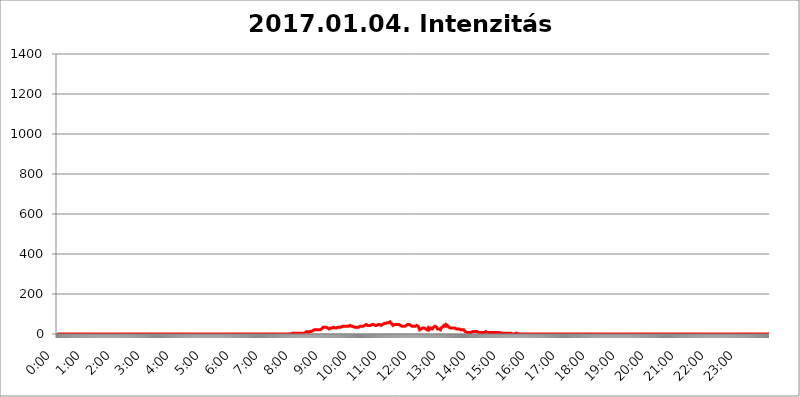
| Category | 2017.01.04. Intenzitás [W/m^2] |
|---|---|
| 0.0 | 0 |
| 0.0006944444444444445 | 0 |
| 0.001388888888888889 | 0 |
| 0.0020833333333333333 | 0 |
| 0.002777777777777778 | 0 |
| 0.003472222222222222 | 0 |
| 0.004166666666666667 | 0 |
| 0.004861111111111111 | 0 |
| 0.005555555555555556 | 0 |
| 0.0062499999999999995 | 0 |
| 0.006944444444444444 | 0 |
| 0.007638888888888889 | 0 |
| 0.008333333333333333 | 0 |
| 0.009027777777777779 | 0 |
| 0.009722222222222222 | 0 |
| 0.010416666666666666 | 0 |
| 0.011111111111111112 | 0 |
| 0.011805555555555555 | 0 |
| 0.012499999999999999 | 0 |
| 0.013194444444444444 | 0 |
| 0.013888888888888888 | 0 |
| 0.014583333333333332 | 0 |
| 0.015277777777777777 | 0 |
| 0.015972222222222224 | 0 |
| 0.016666666666666666 | 0 |
| 0.017361111111111112 | 0 |
| 0.018055555555555557 | 0 |
| 0.01875 | 0 |
| 0.019444444444444445 | 0 |
| 0.02013888888888889 | 0 |
| 0.020833333333333332 | 0 |
| 0.02152777777777778 | 0 |
| 0.022222222222222223 | 0 |
| 0.02291666666666667 | 0 |
| 0.02361111111111111 | 0 |
| 0.024305555555555556 | 0 |
| 0.024999999999999998 | 0 |
| 0.025694444444444447 | 0 |
| 0.02638888888888889 | 0 |
| 0.027083333333333334 | 0 |
| 0.027777777777777776 | 0 |
| 0.02847222222222222 | 0 |
| 0.029166666666666664 | 0 |
| 0.029861111111111113 | 0 |
| 0.030555555555555555 | 0 |
| 0.03125 | 0 |
| 0.03194444444444445 | 0 |
| 0.03263888888888889 | 0 |
| 0.03333333333333333 | 0 |
| 0.034027777777777775 | 0 |
| 0.034722222222222224 | 0 |
| 0.035416666666666666 | 0 |
| 0.036111111111111115 | 0 |
| 0.03680555555555556 | 0 |
| 0.0375 | 0 |
| 0.03819444444444444 | 0 |
| 0.03888888888888889 | 0 |
| 0.03958333333333333 | 0 |
| 0.04027777777777778 | 0 |
| 0.04097222222222222 | 0 |
| 0.041666666666666664 | 0 |
| 0.042361111111111106 | 0 |
| 0.04305555555555556 | 0 |
| 0.043750000000000004 | 0 |
| 0.044444444444444446 | 0 |
| 0.04513888888888889 | 0 |
| 0.04583333333333334 | 0 |
| 0.04652777777777778 | 0 |
| 0.04722222222222222 | 0 |
| 0.04791666666666666 | 0 |
| 0.04861111111111111 | 0 |
| 0.049305555555555554 | 0 |
| 0.049999999999999996 | 0 |
| 0.05069444444444445 | 0 |
| 0.051388888888888894 | 0 |
| 0.052083333333333336 | 0 |
| 0.05277777777777778 | 0 |
| 0.05347222222222222 | 0 |
| 0.05416666666666667 | 0 |
| 0.05486111111111111 | 0 |
| 0.05555555555555555 | 0 |
| 0.05625 | 0 |
| 0.05694444444444444 | 0 |
| 0.057638888888888885 | 0 |
| 0.05833333333333333 | 0 |
| 0.05902777777777778 | 0 |
| 0.059722222222222225 | 0 |
| 0.06041666666666667 | 0 |
| 0.061111111111111116 | 0 |
| 0.06180555555555556 | 0 |
| 0.0625 | 0 |
| 0.06319444444444444 | 0 |
| 0.06388888888888888 | 0 |
| 0.06458333333333334 | 0 |
| 0.06527777777777778 | 0 |
| 0.06597222222222222 | 0 |
| 0.06666666666666667 | 0 |
| 0.06736111111111111 | 0 |
| 0.06805555555555555 | 0 |
| 0.06874999999999999 | 0 |
| 0.06944444444444443 | 0 |
| 0.07013888888888889 | 0 |
| 0.07083333333333333 | 0 |
| 0.07152777777777779 | 0 |
| 0.07222222222222223 | 0 |
| 0.07291666666666667 | 0 |
| 0.07361111111111111 | 0 |
| 0.07430555555555556 | 0 |
| 0.075 | 0 |
| 0.07569444444444444 | 0 |
| 0.0763888888888889 | 0 |
| 0.07708333333333334 | 0 |
| 0.07777777777777778 | 0 |
| 0.07847222222222222 | 0 |
| 0.07916666666666666 | 0 |
| 0.0798611111111111 | 0 |
| 0.08055555555555556 | 0 |
| 0.08125 | 0 |
| 0.08194444444444444 | 0 |
| 0.08263888888888889 | 0 |
| 0.08333333333333333 | 0 |
| 0.08402777777777777 | 0 |
| 0.08472222222222221 | 0 |
| 0.08541666666666665 | 0 |
| 0.08611111111111112 | 0 |
| 0.08680555555555557 | 0 |
| 0.08750000000000001 | 0 |
| 0.08819444444444445 | 0 |
| 0.08888888888888889 | 0 |
| 0.08958333333333333 | 0 |
| 0.09027777777777778 | 0 |
| 0.09097222222222222 | 0 |
| 0.09166666666666667 | 0 |
| 0.09236111111111112 | 0 |
| 0.09305555555555556 | 0 |
| 0.09375 | 0 |
| 0.09444444444444444 | 0 |
| 0.09513888888888888 | 0 |
| 0.09583333333333333 | 0 |
| 0.09652777777777777 | 0 |
| 0.09722222222222222 | 0 |
| 0.09791666666666667 | 0 |
| 0.09861111111111111 | 0 |
| 0.09930555555555555 | 0 |
| 0.09999999999999999 | 0 |
| 0.10069444444444443 | 0 |
| 0.1013888888888889 | 0 |
| 0.10208333333333335 | 0 |
| 0.10277777777777779 | 0 |
| 0.10347222222222223 | 0 |
| 0.10416666666666667 | 0 |
| 0.10486111111111111 | 0 |
| 0.10555555555555556 | 0 |
| 0.10625 | 0 |
| 0.10694444444444444 | 0 |
| 0.1076388888888889 | 0 |
| 0.10833333333333334 | 0 |
| 0.10902777777777778 | 0 |
| 0.10972222222222222 | 0 |
| 0.1111111111111111 | 0 |
| 0.11180555555555556 | 0 |
| 0.11180555555555556 | 0 |
| 0.1125 | 0 |
| 0.11319444444444444 | 0 |
| 0.11388888888888889 | 0 |
| 0.11458333333333333 | 0 |
| 0.11527777777777777 | 0 |
| 0.11597222222222221 | 0 |
| 0.11666666666666665 | 0 |
| 0.1173611111111111 | 0 |
| 0.11805555555555557 | 0 |
| 0.11944444444444445 | 0 |
| 0.12013888888888889 | 0 |
| 0.12083333333333333 | 0 |
| 0.12152777777777778 | 0 |
| 0.12222222222222223 | 0 |
| 0.12291666666666667 | 0 |
| 0.12291666666666667 | 0 |
| 0.12361111111111112 | 0 |
| 0.12430555555555556 | 0 |
| 0.125 | 0 |
| 0.12569444444444444 | 0 |
| 0.12638888888888888 | 0 |
| 0.12708333333333333 | 0 |
| 0.16875 | 0 |
| 0.12847222222222224 | 0 |
| 0.12916666666666668 | 0 |
| 0.12986111111111112 | 0 |
| 0.13055555555555556 | 0 |
| 0.13125 | 0 |
| 0.13194444444444445 | 0 |
| 0.1326388888888889 | 0 |
| 0.13333333333333333 | 0 |
| 0.13402777777777777 | 0 |
| 0.13402777777777777 | 0 |
| 0.13472222222222222 | 0 |
| 0.13541666666666666 | 0 |
| 0.1361111111111111 | 0 |
| 0.13749999999999998 | 0 |
| 0.13819444444444443 | 0 |
| 0.1388888888888889 | 0 |
| 0.13958333333333334 | 0 |
| 0.14027777777777778 | 0 |
| 0.14097222222222222 | 0 |
| 0.14166666666666666 | 0 |
| 0.1423611111111111 | 0 |
| 0.14305555555555557 | 0 |
| 0.14375000000000002 | 0 |
| 0.14444444444444446 | 0 |
| 0.1451388888888889 | 0 |
| 0.1451388888888889 | 0 |
| 0.14652777777777778 | 0 |
| 0.14722222222222223 | 0 |
| 0.14791666666666667 | 0 |
| 0.1486111111111111 | 0 |
| 0.14930555555555555 | 0 |
| 0.15 | 0 |
| 0.15069444444444444 | 0 |
| 0.15138888888888888 | 0 |
| 0.15208333333333332 | 0 |
| 0.15277777777777776 | 0 |
| 0.15347222222222223 | 0 |
| 0.15416666666666667 | 0 |
| 0.15486111111111112 | 0 |
| 0.15555555555555556 | 0 |
| 0.15625 | 0 |
| 0.15694444444444444 | 0 |
| 0.15763888888888888 | 0 |
| 0.15833333333333333 | 0 |
| 0.15902777777777777 | 0 |
| 0.15972222222222224 | 0 |
| 0.16041666666666668 | 0 |
| 0.16111111111111112 | 0 |
| 0.16180555555555556 | 0 |
| 0.1625 | 0 |
| 0.16319444444444445 | 0 |
| 0.1638888888888889 | 0 |
| 0.16458333333333333 | 0 |
| 0.16527777777777777 | 0 |
| 0.16597222222222222 | 0 |
| 0.16666666666666666 | 0 |
| 0.1673611111111111 | 0 |
| 0.16805555555555554 | 0 |
| 0.16874999999999998 | 0 |
| 0.16944444444444443 | 0 |
| 0.17013888888888887 | 0 |
| 0.1708333333333333 | 0 |
| 0.17152777777777775 | 0 |
| 0.17222222222222225 | 0 |
| 0.1729166666666667 | 0 |
| 0.17361111111111113 | 0 |
| 0.17430555555555557 | 0 |
| 0.17500000000000002 | 0 |
| 0.17569444444444446 | 0 |
| 0.1763888888888889 | 0 |
| 0.17708333333333334 | 0 |
| 0.17777777777777778 | 0 |
| 0.17847222222222223 | 0 |
| 0.17916666666666667 | 0 |
| 0.1798611111111111 | 0 |
| 0.18055555555555555 | 0 |
| 0.18125 | 0 |
| 0.18194444444444444 | 0 |
| 0.1826388888888889 | 0 |
| 0.18333333333333335 | 0 |
| 0.1840277777777778 | 0 |
| 0.18472222222222223 | 0 |
| 0.18541666666666667 | 0 |
| 0.18611111111111112 | 0 |
| 0.18680555555555556 | 0 |
| 0.1875 | 0 |
| 0.18819444444444444 | 0 |
| 0.18888888888888888 | 0 |
| 0.18958333333333333 | 0 |
| 0.19027777777777777 | 0 |
| 0.1909722222222222 | 0 |
| 0.19166666666666665 | 0 |
| 0.19236111111111112 | 0 |
| 0.19305555555555554 | 0 |
| 0.19375 | 0 |
| 0.19444444444444445 | 0 |
| 0.1951388888888889 | 0 |
| 0.19583333333333333 | 0 |
| 0.19652777777777777 | 0 |
| 0.19722222222222222 | 0 |
| 0.19791666666666666 | 0 |
| 0.1986111111111111 | 0 |
| 0.19930555555555554 | 0 |
| 0.19999999999999998 | 0 |
| 0.20069444444444443 | 0 |
| 0.20138888888888887 | 0 |
| 0.2020833333333333 | 0 |
| 0.2027777777777778 | 0 |
| 0.2034722222222222 | 0 |
| 0.2041666666666667 | 0 |
| 0.20486111111111113 | 0 |
| 0.20555555555555557 | 0 |
| 0.20625000000000002 | 0 |
| 0.20694444444444446 | 0 |
| 0.2076388888888889 | 0 |
| 0.20833333333333334 | 0 |
| 0.20902777777777778 | 0 |
| 0.20972222222222223 | 0 |
| 0.21041666666666667 | 0 |
| 0.2111111111111111 | 0 |
| 0.21180555555555555 | 0 |
| 0.2125 | 0 |
| 0.21319444444444444 | 0 |
| 0.2138888888888889 | 0 |
| 0.21458333333333335 | 0 |
| 0.2152777777777778 | 0 |
| 0.21597222222222223 | 0 |
| 0.21666666666666667 | 0 |
| 0.21736111111111112 | 0 |
| 0.21805555555555556 | 0 |
| 0.21875 | 0 |
| 0.21944444444444444 | 0 |
| 0.22013888888888888 | 0 |
| 0.22083333333333333 | 0 |
| 0.22152777777777777 | 0 |
| 0.2222222222222222 | 0 |
| 0.22291666666666665 | 0 |
| 0.2236111111111111 | 0 |
| 0.22430555555555556 | 0 |
| 0.225 | 0 |
| 0.22569444444444445 | 0 |
| 0.2263888888888889 | 0 |
| 0.22708333333333333 | 0 |
| 0.22777777777777777 | 0 |
| 0.22847222222222222 | 0 |
| 0.22916666666666666 | 0 |
| 0.2298611111111111 | 0 |
| 0.23055555555555554 | 0 |
| 0.23124999999999998 | 0 |
| 0.23194444444444443 | 0 |
| 0.23263888888888887 | 0 |
| 0.2333333333333333 | 0 |
| 0.2340277777777778 | 0 |
| 0.2347222222222222 | 0 |
| 0.2354166666666667 | 0 |
| 0.23611111111111113 | 0 |
| 0.23680555555555557 | 0 |
| 0.23750000000000002 | 0 |
| 0.23819444444444446 | 0 |
| 0.2388888888888889 | 0 |
| 0.23958333333333334 | 0 |
| 0.24027777777777778 | 0 |
| 0.24097222222222223 | 0 |
| 0.24166666666666667 | 0 |
| 0.2423611111111111 | 0 |
| 0.24305555555555555 | 0 |
| 0.24375 | 0 |
| 0.24444444444444446 | 0 |
| 0.24513888888888888 | 0 |
| 0.24583333333333335 | 0 |
| 0.2465277777777778 | 0 |
| 0.24722222222222223 | 0 |
| 0.24791666666666667 | 0 |
| 0.24861111111111112 | 0 |
| 0.24930555555555556 | 0 |
| 0.25 | 0 |
| 0.25069444444444444 | 0 |
| 0.2513888888888889 | 0 |
| 0.2520833333333333 | 0 |
| 0.25277777777777777 | 0 |
| 0.2534722222222222 | 0 |
| 0.25416666666666665 | 0 |
| 0.2548611111111111 | 0 |
| 0.2555555555555556 | 0 |
| 0.25625000000000003 | 0 |
| 0.2569444444444445 | 0 |
| 0.2576388888888889 | 0 |
| 0.25833333333333336 | 0 |
| 0.2590277777777778 | 0 |
| 0.25972222222222224 | 0 |
| 0.2604166666666667 | 0 |
| 0.2611111111111111 | 0 |
| 0.26180555555555557 | 0 |
| 0.2625 | 0 |
| 0.26319444444444445 | 0 |
| 0.2638888888888889 | 0 |
| 0.26458333333333334 | 0 |
| 0.2652777777777778 | 0 |
| 0.2659722222222222 | 0 |
| 0.26666666666666666 | 0 |
| 0.2673611111111111 | 0 |
| 0.26805555555555555 | 0 |
| 0.26875 | 0 |
| 0.26944444444444443 | 0 |
| 0.2701388888888889 | 0 |
| 0.2708333333333333 | 0 |
| 0.27152777777777776 | 0 |
| 0.2722222222222222 | 0 |
| 0.27291666666666664 | 0 |
| 0.2736111111111111 | 0 |
| 0.2743055555555555 | 0 |
| 0.27499999999999997 | 0 |
| 0.27569444444444446 | 0 |
| 0.27638888888888885 | 0 |
| 0.27708333333333335 | 0 |
| 0.2777777777777778 | 0 |
| 0.27847222222222223 | 0 |
| 0.2791666666666667 | 0 |
| 0.2798611111111111 | 0 |
| 0.28055555555555556 | 0 |
| 0.28125 | 0 |
| 0.28194444444444444 | 0 |
| 0.2826388888888889 | 0 |
| 0.2833333333333333 | 0 |
| 0.28402777777777777 | 0 |
| 0.2847222222222222 | 0 |
| 0.28541666666666665 | 0 |
| 0.28611111111111115 | 0 |
| 0.28680555555555554 | 0 |
| 0.28750000000000003 | 0 |
| 0.2881944444444445 | 0 |
| 0.2888888888888889 | 0 |
| 0.28958333333333336 | 0 |
| 0.2902777777777778 | 0 |
| 0.29097222222222224 | 0 |
| 0.2916666666666667 | 0 |
| 0.2923611111111111 | 0 |
| 0.29305555555555557 | 0 |
| 0.29375 | 0 |
| 0.29444444444444445 | 0 |
| 0.2951388888888889 | 0 |
| 0.29583333333333334 | 0 |
| 0.2965277777777778 | 0 |
| 0.2972222222222222 | 0 |
| 0.29791666666666666 | 0 |
| 0.2986111111111111 | 0 |
| 0.29930555555555555 | 0 |
| 0.3 | 0 |
| 0.30069444444444443 | 0 |
| 0.3013888888888889 | 0 |
| 0.3020833333333333 | 0 |
| 0.30277777777777776 | 0 |
| 0.3034722222222222 | 0 |
| 0.30416666666666664 | 0 |
| 0.3048611111111111 | 0 |
| 0.3055555555555555 | 0 |
| 0.30624999999999997 | 0 |
| 0.3069444444444444 | 0 |
| 0.3076388888888889 | 0 |
| 0.30833333333333335 | 0 |
| 0.3090277777777778 | 0 |
| 0.30972222222222223 | 0 |
| 0.3104166666666667 | 0 |
| 0.3111111111111111 | 0 |
| 0.31180555555555556 | 0 |
| 0.3125 | 0 |
| 0.31319444444444444 | 0 |
| 0.3138888888888889 | 0 |
| 0.3145833333333333 | 0 |
| 0.31527777777777777 | 0 |
| 0.3159722222222222 | 0 |
| 0.31666666666666665 | 0 |
| 0.31736111111111115 | 0 |
| 0.31805555555555554 | 0 |
| 0.31875000000000003 | 0 |
| 0.3194444444444445 | 0 |
| 0.3201388888888889 | 0 |
| 0.32083333333333336 | 0 |
| 0.3215277777777778 | 0 |
| 0.32222222222222224 | 0 |
| 0.3229166666666667 | 0 |
| 0.3236111111111111 | 0 |
| 0.32430555555555557 | 0 |
| 0.325 | 0 |
| 0.32569444444444445 | 0 |
| 0.3263888888888889 | 0 |
| 0.32708333333333334 | 0 |
| 0.3277777777777778 | 0 |
| 0.3284722222222222 | 0 |
| 0.32916666666666666 | 3.525 |
| 0.3298611111111111 | 3.525 |
| 0.33055555555555555 | 3.525 |
| 0.33125 | 3.525 |
| 0.33194444444444443 | 3.525 |
| 0.3326388888888889 | 3.525 |
| 0.3333333333333333 | 3.525 |
| 0.3340277777777778 | 3.525 |
| 0.3347222222222222 | 3.525 |
| 0.3354166666666667 | 3.525 |
| 0.3361111111111111 | 3.525 |
| 0.3368055555555556 | 3.525 |
| 0.33749999999999997 | 3.525 |
| 0.33819444444444446 | 3.525 |
| 0.33888888888888885 | 3.525 |
| 0.33958333333333335 | 3.525 |
| 0.34027777777777773 | 3.525 |
| 0.34097222222222223 | 3.525 |
| 0.3416666666666666 | 3.525 |
| 0.3423611111111111 | 3.525 |
| 0.3430555555555555 | 3.525 |
| 0.34375 | 3.525 |
| 0.3444444444444445 | 3.525 |
| 0.3451388888888889 | 3.525 |
| 0.3458333333333334 | 3.525 |
| 0.34652777777777777 | 3.525 |
| 0.34722222222222227 | 7.887 |
| 0.34791666666666665 | 7.887 |
| 0.34861111111111115 | 12.257 |
| 0.34930555555555554 | 12.257 |
| 0.35000000000000003 | 12.257 |
| 0.3506944444444444 | 7.887 |
| 0.3513888888888889 | 7.887 |
| 0.3520833333333333 | 7.887 |
| 0.3527777777777778 | 12.257 |
| 0.3534722222222222 | 12.257 |
| 0.3541666666666667 | 12.257 |
| 0.3548611111111111 | 12.257 |
| 0.35555555555555557 | 12.257 |
| 0.35625 | 12.257 |
| 0.35694444444444445 | 12.257 |
| 0.3576388888888889 | 16.636 |
| 0.35833333333333334 | 16.636 |
| 0.3590277777777778 | 16.636 |
| 0.3597222222222222 | 16.636 |
| 0.36041666666666666 | 21.024 |
| 0.3611111111111111 | 21.024 |
| 0.36180555555555555 | 21.024 |
| 0.3625 | 21.024 |
| 0.36319444444444443 | 21.024 |
| 0.3638888888888889 | 21.024 |
| 0.3645833333333333 | 21.024 |
| 0.3652777777777778 | 21.024 |
| 0.3659722222222222 | 21.024 |
| 0.3666666666666667 | 21.024 |
| 0.3673611111111111 | 21.024 |
| 0.3680555555555556 | 21.024 |
| 0.36874999999999997 | 21.024 |
| 0.36944444444444446 | 21.024 |
| 0.37013888888888885 | 25.419 |
| 0.37083333333333335 | 25.419 |
| 0.37152777777777773 | 29.823 |
| 0.37222222222222223 | 29.823 |
| 0.3729166666666666 | 34.234 |
| 0.3736111111111111 | 34.234 |
| 0.3743055555555555 | 34.234 |
| 0.375 | 34.234 |
| 0.3756944444444445 | 34.234 |
| 0.3763888888888889 | 34.234 |
| 0.3770833333333334 | 34.234 |
| 0.37777777777777777 | 34.234 |
| 0.37847222222222227 | 29.823 |
| 0.37916666666666665 | 29.823 |
| 0.37986111111111115 | 29.823 |
| 0.38055555555555554 | 25.419 |
| 0.38125000000000003 | 25.419 |
| 0.3819444444444444 | 25.419 |
| 0.3826388888888889 | 25.419 |
| 0.3833333333333333 | 29.823 |
| 0.3840277777777778 | 29.823 |
| 0.3847222222222222 | 29.823 |
| 0.3854166666666667 | 29.823 |
| 0.3861111111111111 | 34.234 |
| 0.38680555555555557 | 34.234 |
| 0.3875 | 34.234 |
| 0.38819444444444445 | 29.823 |
| 0.3888888888888889 | 29.823 |
| 0.38958333333333334 | 29.823 |
| 0.3902777777777778 | 29.823 |
| 0.3909722222222222 | 29.823 |
| 0.39166666666666666 | 29.823 |
| 0.3923611111111111 | 29.823 |
| 0.39305555555555555 | 34.234 |
| 0.39375 | 34.234 |
| 0.39444444444444443 | 34.234 |
| 0.3951388888888889 | 34.234 |
| 0.3958333333333333 | 34.234 |
| 0.3965277777777778 | 34.234 |
| 0.3972222222222222 | 34.234 |
| 0.3979166666666667 | 34.234 |
| 0.3986111111111111 | 34.234 |
| 0.3993055555555556 | 38.653 |
| 0.39999999999999997 | 38.653 |
| 0.40069444444444446 | 38.653 |
| 0.40138888888888885 | 38.653 |
| 0.40208333333333335 | 38.653 |
| 0.40277777777777773 | 38.653 |
| 0.40347222222222223 | 38.653 |
| 0.4041666666666666 | 38.653 |
| 0.4048611111111111 | 38.653 |
| 0.4055555555555555 | 38.653 |
| 0.40625 | 38.653 |
| 0.4069444444444445 | 38.653 |
| 0.4076388888888889 | 38.653 |
| 0.4083333333333334 | 38.653 |
| 0.40902777777777777 | 38.653 |
| 0.40972222222222227 | 38.653 |
| 0.41041666666666665 | 43.079 |
| 0.41111111111111115 | 43.079 |
| 0.41180555555555554 | 38.653 |
| 0.41250000000000003 | 38.653 |
| 0.4131944444444444 | 38.653 |
| 0.4138888888888889 | 38.653 |
| 0.4145833333333333 | 38.653 |
| 0.4152777777777778 | 34.234 |
| 0.4159722222222222 | 34.234 |
| 0.4166666666666667 | 34.234 |
| 0.4173611111111111 | 34.234 |
| 0.41805555555555557 | 34.234 |
| 0.41875 | 34.234 |
| 0.41944444444444445 | 34.234 |
| 0.4201388888888889 | 34.234 |
| 0.42083333333333334 | 34.234 |
| 0.4215277777777778 | 34.234 |
| 0.4222222222222222 | 34.234 |
| 0.42291666666666666 | 34.234 |
| 0.4236111111111111 | 34.234 |
| 0.42430555555555555 | 34.234 |
| 0.425 | 38.653 |
| 0.42569444444444443 | 38.653 |
| 0.4263888888888889 | 38.653 |
| 0.4270833333333333 | 38.653 |
| 0.4277777777777778 | 38.653 |
| 0.4284722222222222 | 38.653 |
| 0.4291666666666667 | 38.653 |
| 0.4298611111111111 | 43.079 |
| 0.4305555555555556 | 43.079 |
| 0.43124999999999997 | 43.079 |
| 0.43194444444444446 | 43.079 |
| 0.43263888888888885 | 47.511 |
| 0.43333333333333335 | 47.511 |
| 0.43402777777777773 | 43.079 |
| 0.43472222222222223 | 43.079 |
| 0.4354166666666666 | 43.079 |
| 0.4361111111111111 | 43.079 |
| 0.4368055555555555 | 43.079 |
| 0.4375 | 43.079 |
| 0.4381944444444445 | 43.079 |
| 0.4388888888888889 | 43.079 |
| 0.4395833333333334 | 43.079 |
| 0.44027777777777777 | 47.511 |
| 0.44097222222222227 | 47.511 |
| 0.44166666666666665 | 47.511 |
| 0.44236111111111115 | 47.511 |
| 0.44305555555555554 | 47.511 |
| 0.44375000000000003 | 47.511 |
| 0.4444444444444444 | 47.511 |
| 0.4451388888888889 | 47.511 |
| 0.4458333333333333 | 43.079 |
| 0.4465277777777778 | 43.079 |
| 0.4472222222222222 | 43.079 |
| 0.4479166666666667 | 43.079 |
| 0.4486111111111111 | 47.511 |
| 0.44930555555555557 | 47.511 |
| 0.45 | 47.511 |
| 0.45069444444444445 | 47.511 |
| 0.4513888888888889 | 47.511 |
| 0.45208333333333334 | 47.511 |
| 0.4527777777777778 | 43.079 |
| 0.4534722222222222 | 43.079 |
| 0.45416666666666666 | 43.079 |
| 0.4548611111111111 | 43.079 |
| 0.45555555555555555 | 43.079 |
| 0.45625 | 47.511 |
| 0.45694444444444443 | 47.511 |
| 0.4576388888888889 | 47.511 |
| 0.4583333333333333 | 51.951 |
| 0.4590277777777778 | 51.951 |
| 0.4597222222222222 | 51.951 |
| 0.4604166666666667 | 51.951 |
| 0.4611111111111111 | 51.951 |
| 0.4618055555555556 | 56.398 |
| 0.46249999999999997 | 56.398 |
| 0.46319444444444446 | 56.398 |
| 0.46388888888888885 | 56.398 |
| 0.46458333333333335 | 56.398 |
| 0.46527777777777773 | 56.398 |
| 0.46597222222222223 | 56.398 |
| 0.4666666666666666 | 60.85 |
| 0.4673611111111111 | 60.85 |
| 0.4680555555555555 | 56.398 |
| 0.46875 | 51.951 |
| 0.4694444444444445 | 47.511 |
| 0.4701388888888889 | 47.511 |
| 0.4708333333333334 | 43.079 |
| 0.47152777777777777 | 43.079 |
| 0.47222222222222227 | 47.511 |
| 0.47291666666666665 | 47.511 |
| 0.47361111111111115 | 47.511 |
| 0.47430555555555554 | 47.511 |
| 0.47500000000000003 | 47.511 |
| 0.4756944444444444 | 47.511 |
| 0.4763888888888889 | 47.511 |
| 0.4770833333333333 | 47.511 |
| 0.4777777777777778 | 47.511 |
| 0.4784722222222222 | 47.511 |
| 0.4791666666666667 | 47.511 |
| 0.4798611111111111 | 47.511 |
| 0.48055555555555557 | 43.079 |
| 0.48125 | 43.079 |
| 0.48194444444444445 | 38.653 |
| 0.4826388888888889 | 38.653 |
| 0.48333333333333334 | 38.653 |
| 0.4840277777777778 | 38.653 |
| 0.4847222222222222 | 38.653 |
| 0.48541666666666666 | 38.653 |
| 0.4861111111111111 | 38.653 |
| 0.48680555555555555 | 38.653 |
| 0.4875 | 38.653 |
| 0.48819444444444443 | 38.653 |
| 0.4888888888888889 | 38.653 |
| 0.4895833333333333 | 43.079 |
| 0.4902777777777778 | 47.511 |
| 0.4909722222222222 | 47.511 |
| 0.4916666666666667 | 47.511 |
| 0.4923611111111111 | 47.511 |
| 0.4930555555555556 | 47.511 |
| 0.49374999999999997 | 47.511 |
| 0.49444444444444446 | 47.511 |
| 0.49513888888888885 | 43.079 |
| 0.49583333333333335 | 43.079 |
| 0.49652777777777773 | 43.079 |
| 0.49722222222222223 | 38.653 |
| 0.4979166666666666 | 38.653 |
| 0.4986111111111111 | 38.653 |
| 0.4993055555555555 | 38.653 |
| 0.5 | 38.653 |
| 0.5006944444444444 | 38.653 |
| 0.5013888888888889 | 38.653 |
| 0.5020833333333333 | 38.653 |
| 0.5027777777777778 | 38.653 |
| 0.5034722222222222 | 38.653 |
| 0.5041666666666667 | 43.079 |
| 0.5048611111111111 | 38.653 |
| 0.5055555555555555 | 38.653 |
| 0.50625 | 38.653 |
| 0.5069444444444444 | 34.234 |
| 0.5076388888888889 | 34.234 |
| 0.5083333333333333 | 21.024 |
| 0.5090277777777777 | 25.419 |
| 0.5097222222222222 | 25.419 |
| 0.5104166666666666 | 25.419 |
| 0.5111111111111112 | 25.419 |
| 0.5118055555555555 | 25.419 |
| 0.5125000000000001 | 29.823 |
| 0.5131944444444444 | 29.823 |
| 0.513888888888889 | 29.823 |
| 0.5145833333333333 | 29.823 |
| 0.5152777777777778 | 29.823 |
| 0.5159722222222222 | 29.823 |
| 0.5166666666666667 | 25.419 |
| 0.517361111111111 | 25.419 |
| 0.5180555555555556 | 21.024 |
| 0.5187499999999999 | 21.024 |
| 0.5194444444444445 | 25.419 |
| 0.5201388888888888 | 29.823 |
| 0.5208333333333334 | 25.419 |
| 0.5215277777777778 | 21.024 |
| 0.5222222222222223 | 21.024 |
| 0.5229166666666667 | 21.024 |
| 0.5236111111111111 | 29.823 |
| 0.5243055555555556 | 29.823 |
| 0.525 | 29.823 |
| 0.5256944444444445 | 25.419 |
| 0.5263888888888889 | 29.823 |
| 0.5270833333333333 | 29.823 |
| 0.5277777777777778 | 34.234 |
| 0.5284722222222222 | 29.823 |
| 0.5291666666666667 | 34.234 |
| 0.5298611111111111 | 38.653 |
| 0.5305555555555556 | 38.653 |
| 0.53125 | 34.234 |
| 0.5319444444444444 | 34.234 |
| 0.5326388888888889 | 29.823 |
| 0.5333333333333333 | 25.419 |
| 0.5340277777777778 | 25.419 |
| 0.5347222222222222 | 25.419 |
| 0.5354166666666667 | 25.419 |
| 0.5361111111111111 | 21.024 |
| 0.5368055555555555 | 21.024 |
| 0.5375 | 21.024 |
| 0.5381944444444444 | 29.823 |
| 0.5388888888888889 | 29.823 |
| 0.5395833333333333 | 29.823 |
| 0.5402777777777777 | 34.234 |
| 0.5409722222222222 | 38.653 |
| 0.5416666666666666 | 38.653 |
| 0.5423611111111112 | 43.079 |
| 0.5430555555555555 | 43.079 |
| 0.5437500000000001 | 43.079 |
| 0.5444444444444444 | 38.653 |
| 0.545138888888889 | 47.511 |
| 0.5458333333333333 | 51.951 |
| 0.5465277777777778 | 47.511 |
| 0.5472222222222222 | 43.079 |
| 0.5479166666666667 | 38.653 |
| 0.548611111111111 | 38.653 |
| 0.5493055555555556 | 34.234 |
| 0.5499999999999999 | 29.823 |
| 0.5506944444444445 | 29.823 |
| 0.5513888888888888 | 29.823 |
| 0.5520833333333334 | 29.823 |
| 0.5527777777777778 | 29.823 |
| 0.5534722222222223 | 29.823 |
| 0.5541666666666667 | 29.823 |
| 0.5548611111111111 | 29.823 |
| 0.5555555555555556 | 29.823 |
| 0.55625 | 29.823 |
| 0.5569444444444445 | 25.419 |
| 0.5576388888888889 | 29.823 |
| 0.5583333333333333 | 25.419 |
| 0.5590277777777778 | 29.823 |
| 0.5597222222222222 | 25.419 |
| 0.5604166666666667 | 29.823 |
| 0.5611111111111111 | 29.823 |
| 0.5618055555555556 | 25.419 |
| 0.5625 | 29.823 |
| 0.5631944444444444 | 29.823 |
| 0.5638888888888889 | 25.419 |
| 0.5645833333333333 | 25.419 |
| 0.5652777777777778 | 21.024 |
| 0.5659722222222222 | 21.024 |
| 0.5666666666666667 | 21.024 |
| 0.5673611111111111 | 21.024 |
| 0.5680555555555555 | 21.024 |
| 0.56875 | 21.024 |
| 0.5694444444444444 | 21.024 |
| 0.5701388888888889 | 21.024 |
| 0.5708333333333333 | 16.636 |
| 0.5715277777777777 | 16.636 |
| 0.5722222222222222 | 12.257 |
| 0.5729166666666666 | 12.257 |
| 0.5736111111111112 | 12.257 |
| 0.5743055555555555 | 7.887 |
| 0.5750000000000001 | 7.887 |
| 0.5756944444444444 | 7.887 |
| 0.576388888888889 | 7.887 |
| 0.5770833333333333 | 7.887 |
| 0.5777777777777778 | 7.887 |
| 0.5784722222222222 | 7.887 |
| 0.5791666666666667 | 7.887 |
| 0.579861111111111 | 7.887 |
| 0.5805555555555556 | 7.887 |
| 0.5812499999999999 | 7.887 |
| 0.5819444444444445 | 12.257 |
| 0.5826388888888888 | 12.257 |
| 0.5833333333333334 | 12.257 |
| 0.5840277777777778 | 12.257 |
| 0.5847222222222223 | 12.257 |
| 0.5854166666666667 | 12.257 |
| 0.5861111111111111 | 12.257 |
| 0.5868055555555556 | 12.257 |
| 0.5875 | 12.257 |
| 0.5881944444444445 | 12.257 |
| 0.5888888888888889 | 12.257 |
| 0.5895833333333333 | 12.257 |
| 0.5902777777777778 | 12.257 |
| 0.5909722222222222 | 7.887 |
| 0.5916666666666667 | 7.887 |
| 0.5923611111111111 | 7.887 |
| 0.5930555555555556 | 7.887 |
| 0.59375 | 7.887 |
| 0.5944444444444444 | 7.887 |
| 0.5951388888888889 | 7.887 |
| 0.5958333333333333 | 7.887 |
| 0.5965277777777778 | 7.887 |
| 0.5972222222222222 | 7.887 |
| 0.5979166666666667 | 7.887 |
| 0.5986111111111111 | 7.887 |
| 0.5993055555555555 | 7.887 |
| 0.6 | 7.887 |
| 0.6006944444444444 | 7.887 |
| 0.6013888888888889 | 12.257 |
| 0.6020833333333333 | 7.887 |
| 0.6027777777777777 | 7.887 |
| 0.6034722222222222 | 7.887 |
| 0.6041666666666666 | 7.887 |
| 0.6048611111111112 | 7.887 |
| 0.6055555555555555 | 7.887 |
| 0.6062500000000001 | 7.887 |
| 0.6069444444444444 | 7.887 |
| 0.607638888888889 | 7.887 |
| 0.6083333333333333 | 7.887 |
| 0.6090277777777778 | 7.887 |
| 0.6097222222222222 | 7.887 |
| 0.6104166666666667 | 7.887 |
| 0.611111111111111 | 7.887 |
| 0.6118055555555556 | 7.887 |
| 0.6124999999999999 | 7.887 |
| 0.6131944444444445 | 7.887 |
| 0.6138888888888888 | 7.887 |
| 0.6145833333333334 | 7.887 |
| 0.6152777777777778 | 7.887 |
| 0.6159722222222223 | 7.887 |
| 0.6166666666666667 | 7.887 |
| 0.6173611111111111 | 7.887 |
| 0.6180555555555556 | 7.887 |
| 0.61875 | 3.525 |
| 0.6194444444444445 | 7.887 |
| 0.6201388888888889 | 7.887 |
| 0.6208333333333333 | 3.525 |
| 0.6215277777777778 | 3.525 |
| 0.6222222222222222 | 3.525 |
| 0.6229166666666667 | 3.525 |
| 0.6236111111111111 | 3.525 |
| 0.6243055555555556 | 3.525 |
| 0.625 | 3.525 |
| 0.6256944444444444 | 3.525 |
| 0.6263888888888889 | 3.525 |
| 0.6270833333333333 | 3.525 |
| 0.6277777777777778 | 3.525 |
| 0.6284722222222222 | 3.525 |
| 0.6291666666666667 | 3.525 |
| 0.6298611111111111 | 3.525 |
| 0.6305555555555555 | 3.525 |
| 0.63125 | 3.525 |
| 0.6319444444444444 | 3.525 |
| 0.6326388888888889 | 3.525 |
| 0.6333333333333333 | 3.525 |
| 0.6340277777777777 | 3.525 |
| 0.6347222222222222 | 3.525 |
| 0.6354166666666666 | 3.525 |
| 0.6361111111111112 | 3.525 |
| 0.6368055555555555 | 3.525 |
| 0.6375000000000001 | 0 |
| 0.6381944444444444 | 0 |
| 0.638888888888889 | 0 |
| 0.6395833333333333 | 3.525 |
| 0.6402777777777778 | 0 |
| 0.6409722222222222 | 0 |
| 0.6416666666666667 | 0 |
| 0.642361111111111 | 3.525 |
| 0.6430555555555556 | 3.525 |
| 0.6437499999999999 | 3.525 |
| 0.6444444444444445 | 3.525 |
| 0.6451388888888888 | 3.525 |
| 0.6458333333333334 | 3.525 |
| 0.6465277777777778 | 0 |
| 0.6472222222222223 | 0 |
| 0.6479166666666667 | 0 |
| 0.6486111111111111 | 0 |
| 0.6493055555555556 | 0 |
| 0.65 | 0 |
| 0.6506944444444445 | 0 |
| 0.6513888888888889 | 0 |
| 0.6520833333333333 | 0 |
| 0.6527777777777778 | 0 |
| 0.6534722222222222 | 0 |
| 0.6541666666666667 | 0 |
| 0.6548611111111111 | 0 |
| 0.6555555555555556 | 0 |
| 0.65625 | 0 |
| 0.6569444444444444 | 0 |
| 0.6576388888888889 | 0 |
| 0.6583333333333333 | 0 |
| 0.6590277777777778 | 0 |
| 0.6597222222222222 | 0 |
| 0.6604166666666667 | 0 |
| 0.6611111111111111 | 0 |
| 0.6618055555555555 | 0 |
| 0.6625 | 0 |
| 0.6631944444444444 | 0 |
| 0.6638888888888889 | 0 |
| 0.6645833333333333 | 0 |
| 0.6652777777777777 | 0 |
| 0.6659722222222222 | 0 |
| 0.6666666666666666 | 0 |
| 0.6673611111111111 | 0 |
| 0.6680555555555556 | 0 |
| 0.6687500000000001 | 0 |
| 0.6694444444444444 | 0 |
| 0.6701388888888888 | 0 |
| 0.6708333333333334 | 0 |
| 0.6715277777777778 | 0 |
| 0.6722222222222222 | 0 |
| 0.6729166666666666 | 0 |
| 0.6736111111111112 | 0 |
| 0.6743055555555556 | 0 |
| 0.6749999999999999 | 0 |
| 0.6756944444444444 | 0 |
| 0.6763888888888889 | 0 |
| 0.6770833333333334 | 0 |
| 0.6777777777777777 | 0 |
| 0.6784722222222223 | 0 |
| 0.6791666666666667 | 0 |
| 0.6798611111111111 | 0 |
| 0.6805555555555555 | 0 |
| 0.68125 | 0 |
| 0.6819444444444445 | 0 |
| 0.6826388888888889 | 0 |
| 0.6833333333333332 | 0 |
| 0.6840277777777778 | 0 |
| 0.6847222222222222 | 0 |
| 0.6854166666666667 | 0 |
| 0.686111111111111 | 0 |
| 0.6868055555555556 | 0 |
| 0.6875 | 0 |
| 0.6881944444444444 | 0 |
| 0.688888888888889 | 0 |
| 0.6895833333333333 | 0 |
| 0.6902777777777778 | 0 |
| 0.6909722222222222 | 0 |
| 0.6916666666666668 | 0 |
| 0.6923611111111111 | 0 |
| 0.6930555555555555 | 0 |
| 0.69375 | 0 |
| 0.6944444444444445 | 0 |
| 0.6951388888888889 | 0 |
| 0.6958333333333333 | 0 |
| 0.6965277777777777 | 0 |
| 0.6972222222222223 | 0 |
| 0.6979166666666666 | 0 |
| 0.6986111111111111 | 0 |
| 0.6993055555555556 | 0 |
| 0.7000000000000001 | 0 |
| 0.7006944444444444 | 0 |
| 0.7013888888888888 | 0 |
| 0.7020833333333334 | 0 |
| 0.7027777777777778 | 0 |
| 0.7034722222222222 | 0 |
| 0.7041666666666666 | 0 |
| 0.7048611111111112 | 0 |
| 0.7055555555555556 | 0 |
| 0.7062499999999999 | 0 |
| 0.7069444444444444 | 0 |
| 0.7076388888888889 | 0 |
| 0.7083333333333334 | 0 |
| 0.7090277777777777 | 0 |
| 0.7097222222222223 | 0 |
| 0.7104166666666667 | 0 |
| 0.7111111111111111 | 0 |
| 0.7118055555555555 | 0 |
| 0.7125 | 0 |
| 0.7131944444444445 | 0 |
| 0.7138888888888889 | 0 |
| 0.7145833333333332 | 0 |
| 0.7152777777777778 | 0 |
| 0.7159722222222222 | 0 |
| 0.7166666666666667 | 0 |
| 0.717361111111111 | 0 |
| 0.7180555555555556 | 0 |
| 0.71875 | 0 |
| 0.7194444444444444 | 0 |
| 0.720138888888889 | 0 |
| 0.7208333333333333 | 0 |
| 0.7215277777777778 | 0 |
| 0.7222222222222222 | 0 |
| 0.7229166666666668 | 0 |
| 0.7236111111111111 | 0 |
| 0.7243055555555555 | 0 |
| 0.725 | 0 |
| 0.7256944444444445 | 0 |
| 0.7263888888888889 | 0 |
| 0.7270833333333333 | 0 |
| 0.7277777777777777 | 0 |
| 0.7284722222222223 | 0 |
| 0.7291666666666666 | 0 |
| 0.7298611111111111 | 0 |
| 0.7305555555555556 | 0 |
| 0.7312500000000001 | 0 |
| 0.7319444444444444 | 0 |
| 0.7326388888888888 | 0 |
| 0.7333333333333334 | 0 |
| 0.7340277777777778 | 0 |
| 0.7347222222222222 | 0 |
| 0.7354166666666666 | 0 |
| 0.7361111111111112 | 0 |
| 0.7368055555555556 | 0 |
| 0.7374999999999999 | 0 |
| 0.7381944444444444 | 0 |
| 0.7388888888888889 | 0 |
| 0.7395833333333334 | 0 |
| 0.7402777777777777 | 0 |
| 0.7409722222222223 | 0 |
| 0.7416666666666667 | 0 |
| 0.7423611111111111 | 0 |
| 0.7430555555555555 | 0 |
| 0.74375 | 0 |
| 0.7444444444444445 | 0 |
| 0.7451388888888889 | 0 |
| 0.7458333333333332 | 0 |
| 0.7465277777777778 | 0 |
| 0.7472222222222222 | 0 |
| 0.7479166666666667 | 0 |
| 0.748611111111111 | 0 |
| 0.7493055555555556 | 0 |
| 0.75 | 0 |
| 0.7506944444444444 | 0 |
| 0.751388888888889 | 0 |
| 0.7520833333333333 | 0 |
| 0.7527777777777778 | 0 |
| 0.7534722222222222 | 0 |
| 0.7541666666666668 | 0 |
| 0.7548611111111111 | 0 |
| 0.7555555555555555 | 0 |
| 0.75625 | 0 |
| 0.7569444444444445 | 0 |
| 0.7576388888888889 | 0 |
| 0.7583333333333333 | 0 |
| 0.7590277777777777 | 0 |
| 0.7597222222222223 | 0 |
| 0.7604166666666666 | 0 |
| 0.7611111111111111 | 0 |
| 0.7618055555555556 | 0 |
| 0.7625000000000001 | 0 |
| 0.7631944444444444 | 0 |
| 0.7638888888888888 | 0 |
| 0.7645833333333334 | 0 |
| 0.7652777777777778 | 0 |
| 0.7659722222222222 | 0 |
| 0.7666666666666666 | 0 |
| 0.7673611111111112 | 0 |
| 0.7680555555555556 | 0 |
| 0.7687499999999999 | 0 |
| 0.7694444444444444 | 0 |
| 0.7701388888888889 | 0 |
| 0.7708333333333334 | 0 |
| 0.7715277777777777 | 0 |
| 0.7722222222222223 | 0 |
| 0.7729166666666667 | 0 |
| 0.7736111111111111 | 0 |
| 0.7743055555555555 | 0 |
| 0.775 | 0 |
| 0.7756944444444445 | 0 |
| 0.7763888888888889 | 0 |
| 0.7770833333333332 | 0 |
| 0.7777777777777778 | 0 |
| 0.7784722222222222 | 0 |
| 0.7791666666666667 | 0 |
| 0.779861111111111 | 0 |
| 0.7805555555555556 | 0 |
| 0.78125 | 0 |
| 0.7819444444444444 | 0 |
| 0.782638888888889 | 0 |
| 0.7833333333333333 | 0 |
| 0.7840277777777778 | 0 |
| 0.7847222222222222 | 0 |
| 0.7854166666666668 | 0 |
| 0.7861111111111111 | 0 |
| 0.7868055555555555 | 0 |
| 0.7875 | 0 |
| 0.7881944444444445 | 0 |
| 0.7888888888888889 | 0 |
| 0.7895833333333333 | 0 |
| 0.7902777777777777 | 0 |
| 0.7909722222222223 | 0 |
| 0.7916666666666666 | 0 |
| 0.7923611111111111 | 0 |
| 0.7930555555555556 | 0 |
| 0.7937500000000001 | 0 |
| 0.7944444444444444 | 0 |
| 0.7951388888888888 | 0 |
| 0.7958333333333334 | 0 |
| 0.7965277777777778 | 0 |
| 0.7972222222222222 | 0 |
| 0.7979166666666666 | 0 |
| 0.7986111111111112 | 0 |
| 0.7993055555555556 | 0 |
| 0.7999999999999999 | 0 |
| 0.8006944444444444 | 0 |
| 0.8013888888888889 | 0 |
| 0.8020833333333334 | 0 |
| 0.8027777777777777 | 0 |
| 0.8034722222222223 | 0 |
| 0.8041666666666667 | 0 |
| 0.8048611111111111 | 0 |
| 0.8055555555555555 | 0 |
| 0.80625 | 0 |
| 0.8069444444444445 | 0 |
| 0.8076388888888889 | 0 |
| 0.8083333333333332 | 0 |
| 0.8090277777777778 | 0 |
| 0.8097222222222222 | 0 |
| 0.8104166666666667 | 0 |
| 0.811111111111111 | 0 |
| 0.8118055555555556 | 0 |
| 0.8125 | 0 |
| 0.8131944444444444 | 0 |
| 0.813888888888889 | 0 |
| 0.8145833333333333 | 0 |
| 0.8152777777777778 | 0 |
| 0.8159722222222222 | 0 |
| 0.8166666666666668 | 0 |
| 0.8173611111111111 | 0 |
| 0.8180555555555555 | 0 |
| 0.81875 | 0 |
| 0.8194444444444445 | 0 |
| 0.8201388888888889 | 0 |
| 0.8208333333333333 | 0 |
| 0.8215277777777777 | 0 |
| 0.8222222222222223 | 0 |
| 0.8229166666666666 | 0 |
| 0.8236111111111111 | 0 |
| 0.8243055555555556 | 0 |
| 0.8250000000000001 | 0 |
| 0.8256944444444444 | 0 |
| 0.8263888888888888 | 0 |
| 0.8270833333333334 | 0 |
| 0.8277777777777778 | 0 |
| 0.8284722222222222 | 0 |
| 0.8291666666666666 | 0 |
| 0.8298611111111112 | 0 |
| 0.8305555555555556 | 0 |
| 0.8312499999999999 | 0 |
| 0.8319444444444444 | 0 |
| 0.8326388888888889 | 0 |
| 0.8333333333333334 | 0 |
| 0.8340277777777777 | 0 |
| 0.8347222222222223 | 0 |
| 0.8354166666666667 | 0 |
| 0.8361111111111111 | 0 |
| 0.8368055555555555 | 0 |
| 0.8375 | 0 |
| 0.8381944444444445 | 0 |
| 0.8388888888888889 | 0 |
| 0.8395833333333332 | 0 |
| 0.8402777777777778 | 0 |
| 0.8409722222222222 | 0 |
| 0.8416666666666667 | 0 |
| 0.842361111111111 | 0 |
| 0.8430555555555556 | 0 |
| 0.84375 | 0 |
| 0.8444444444444444 | 0 |
| 0.845138888888889 | 0 |
| 0.8458333333333333 | 0 |
| 0.8465277777777778 | 0 |
| 0.8472222222222222 | 0 |
| 0.8479166666666668 | 0 |
| 0.8486111111111111 | 0 |
| 0.8493055555555555 | 0 |
| 0.85 | 0 |
| 0.8506944444444445 | 0 |
| 0.8513888888888889 | 0 |
| 0.8520833333333333 | 0 |
| 0.8527777777777777 | 0 |
| 0.8534722222222223 | 0 |
| 0.8541666666666666 | 0 |
| 0.8548611111111111 | 0 |
| 0.8555555555555556 | 0 |
| 0.8562500000000001 | 0 |
| 0.8569444444444444 | 0 |
| 0.8576388888888888 | 0 |
| 0.8583333333333334 | 0 |
| 0.8590277777777778 | 0 |
| 0.8597222222222222 | 0 |
| 0.8604166666666666 | 0 |
| 0.8611111111111112 | 0 |
| 0.8618055555555556 | 0 |
| 0.8624999999999999 | 0 |
| 0.8631944444444444 | 0 |
| 0.8638888888888889 | 0 |
| 0.8645833333333334 | 0 |
| 0.8652777777777777 | 0 |
| 0.8659722222222223 | 0 |
| 0.8666666666666667 | 0 |
| 0.8673611111111111 | 0 |
| 0.8680555555555555 | 0 |
| 0.86875 | 0 |
| 0.8694444444444445 | 0 |
| 0.8701388888888889 | 0 |
| 0.8708333333333332 | 0 |
| 0.8715277777777778 | 0 |
| 0.8722222222222222 | 0 |
| 0.8729166666666667 | 0 |
| 0.873611111111111 | 0 |
| 0.8743055555555556 | 0 |
| 0.875 | 0 |
| 0.8756944444444444 | 0 |
| 0.876388888888889 | 0 |
| 0.8770833333333333 | 0 |
| 0.8777777777777778 | 0 |
| 0.8784722222222222 | 0 |
| 0.8791666666666668 | 0 |
| 0.8798611111111111 | 0 |
| 0.8805555555555555 | 0 |
| 0.88125 | 0 |
| 0.8819444444444445 | 0 |
| 0.8826388888888889 | 0 |
| 0.8833333333333333 | 0 |
| 0.8840277777777777 | 0 |
| 0.8847222222222223 | 0 |
| 0.8854166666666666 | 0 |
| 0.8861111111111111 | 0 |
| 0.8868055555555556 | 0 |
| 0.8875000000000001 | 0 |
| 0.8881944444444444 | 0 |
| 0.8888888888888888 | 0 |
| 0.8895833333333334 | 0 |
| 0.8902777777777778 | 0 |
| 0.8909722222222222 | 0 |
| 0.8916666666666666 | 0 |
| 0.8923611111111112 | 0 |
| 0.8930555555555556 | 0 |
| 0.8937499999999999 | 0 |
| 0.8944444444444444 | 0 |
| 0.8951388888888889 | 0 |
| 0.8958333333333334 | 0 |
| 0.8965277777777777 | 0 |
| 0.8972222222222223 | 0 |
| 0.8979166666666667 | 0 |
| 0.8986111111111111 | 0 |
| 0.8993055555555555 | 0 |
| 0.9 | 0 |
| 0.9006944444444445 | 0 |
| 0.9013888888888889 | 0 |
| 0.9020833333333332 | 0 |
| 0.9027777777777778 | 0 |
| 0.9034722222222222 | 0 |
| 0.9041666666666667 | 0 |
| 0.904861111111111 | 0 |
| 0.9055555555555556 | 0 |
| 0.90625 | 0 |
| 0.9069444444444444 | 0 |
| 0.907638888888889 | 0 |
| 0.9083333333333333 | 0 |
| 0.9090277777777778 | 0 |
| 0.9097222222222222 | 0 |
| 0.9104166666666668 | 0 |
| 0.9111111111111111 | 0 |
| 0.9118055555555555 | 0 |
| 0.9125 | 0 |
| 0.9131944444444445 | 0 |
| 0.9138888888888889 | 0 |
| 0.9145833333333333 | 0 |
| 0.9152777777777777 | 0 |
| 0.9159722222222223 | 0 |
| 0.9166666666666666 | 0 |
| 0.9173611111111111 | 0 |
| 0.9180555555555556 | 0 |
| 0.9187500000000001 | 0 |
| 0.9194444444444444 | 0 |
| 0.9201388888888888 | 0 |
| 0.9208333333333334 | 0 |
| 0.9215277777777778 | 0 |
| 0.9222222222222222 | 0 |
| 0.9229166666666666 | 0 |
| 0.9236111111111112 | 0 |
| 0.9243055555555556 | 0 |
| 0.9249999999999999 | 0 |
| 0.9256944444444444 | 0 |
| 0.9263888888888889 | 0 |
| 0.9270833333333334 | 0 |
| 0.9277777777777777 | 0 |
| 0.9284722222222223 | 0 |
| 0.9291666666666667 | 0 |
| 0.9298611111111111 | 0 |
| 0.9305555555555555 | 0 |
| 0.93125 | 0 |
| 0.9319444444444445 | 0 |
| 0.9326388888888889 | 0 |
| 0.9333333333333332 | 0 |
| 0.9340277777777778 | 0 |
| 0.9347222222222222 | 0 |
| 0.9354166666666667 | 0 |
| 0.936111111111111 | 0 |
| 0.9368055555555556 | 0 |
| 0.9375 | 0 |
| 0.9381944444444444 | 0 |
| 0.938888888888889 | 0 |
| 0.9395833333333333 | 0 |
| 0.9402777777777778 | 0 |
| 0.9409722222222222 | 0 |
| 0.9416666666666668 | 0 |
| 0.9423611111111111 | 0 |
| 0.9430555555555555 | 0 |
| 0.94375 | 0 |
| 0.9444444444444445 | 0 |
| 0.9451388888888889 | 0 |
| 0.9458333333333333 | 0 |
| 0.9465277777777777 | 0 |
| 0.9472222222222223 | 0 |
| 0.9479166666666666 | 0 |
| 0.9486111111111111 | 0 |
| 0.9493055555555556 | 0 |
| 0.9500000000000001 | 0 |
| 0.9506944444444444 | 0 |
| 0.9513888888888888 | 0 |
| 0.9520833333333334 | 0 |
| 0.9527777777777778 | 0 |
| 0.9534722222222222 | 0 |
| 0.9541666666666666 | 0 |
| 0.9548611111111112 | 0 |
| 0.9555555555555556 | 0 |
| 0.9562499999999999 | 0 |
| 0.9569444444444444 | 0 |
| 0.9576388888888889 | 0 |
| 0.9583333333333334 | 0 |
| 0.9590277777777777 | 0 |
| 0.9597222222222223 | 0 |
| 0.9604166666666667 | 0 |
| 0.9611111111111111 | 0 |
| 0.9618055555555555 | 0 |
| 0.9625 | 0 |
| 0.9631944444444445 | 0 |
| 0.9638888888888889 | 0 |
| 0.9645833333333332 | 0 |
| 0.9652777777777778 | 0 |
| 0.9659722222222222 | 0 |
| 0.9666666666666667 | 0 |
| 0.967361111111111 | 0 |
| 0.9680555555555556 | 0 |
| 0.96875 | 0 |
| 0.9694444444444444 | 0 |
| 0.970138888888889 | 0 |
| 0.9708333333333333 | 0 |
| 0.9715277777777778 | 0 |
| 0.9722222222222222 | 0 |
| 0.9729166666666668 | 0 |
| 0.9736111111111111 | 0 |
| 0.9743055555555555 | 0 |
| 0.975 | 0 |
| 0.9756944444444445 | 0 |
| 0.9763888888888889 | 0 |
| 0.9770833333333333 | 0 |
| 0.9777777777777777 | 0 |
| 0.9784722222222223 | 0 |
| 0.9791666666666666 | 0 |
| 0.9798611111111111 | 0 |
| 0.9805555555555556 | 0 |
| 0.9812500000000001 | 0 |
| 0.9819444444444444 | 0 |
| 0.9826388888888888 | 0 |
| 0.9833333333333334 | 0 |
| 0.9840277777777778 | 0 |
| 0.9847222222222222 | 0 |
| 0.9854166666666666 | 0 |
| 0.9861111111111112 | 0 |
| 0.9868055555555556 | 0 |
| 0.9874999999999999 | 0 |
| 0.9881944444444444 | 0 |
| 0.9888888888888889 | 0 |
| 0.9895833333333334 | 0 |
| 0.9902777777777777 | 0 |
| 0.9909722222222223 | 0 |
| 0.9916666666666667 | 0 |
| 0.9923611111111111 | 0 |
| 0.9930555555555555 | 0 |
| 0.99375 | 0 |
| 0.9944444444444445 | 0 |
| 0.9951388888888889 | 0 |
| 0.9958333333333332 | 0 |
| 0.9965277777777778 | 0 |
| 0.9972222222222222 | 0 |
| 0.9979166666666667 | 0 |
| 0.998611111111111 | 0 |
| 0.9993055555555556 | 0 |